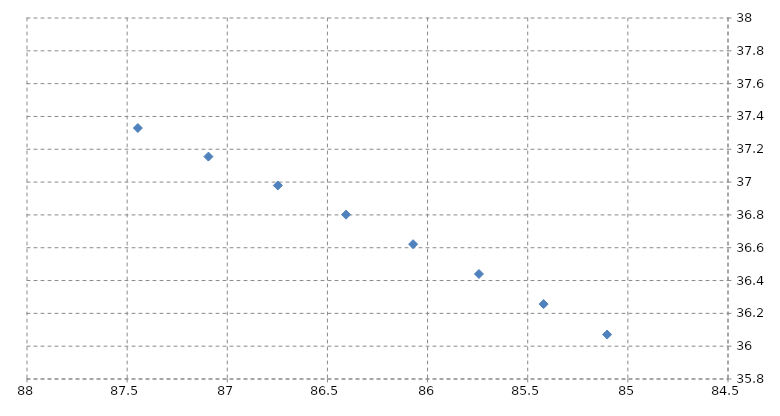
| Category | Series 0 |
|---|---|
| 87.44661460000043 | 37.329 |
| 87.09411271111094 | 37.155 |
| 86.74753637777758 | 36.979 |
| 86.4068855999999 | 36.801 |
| 86.07216037777789 | 36.622 |
| 85.74336071111111 | 36.44 |
| 85.4204866 | 36.256 |
| 85.10353804444412 | 36.071 |